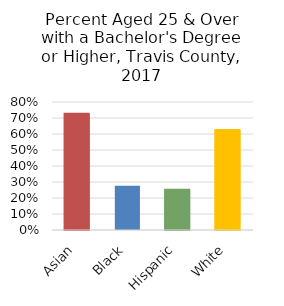
| Category | % Bachelor's Degree or Higher |
|---|---|
| Asian | 0.727 |
| Black | 0.277 |
| Hispanic | 0.252 |
| White | 0.625 |